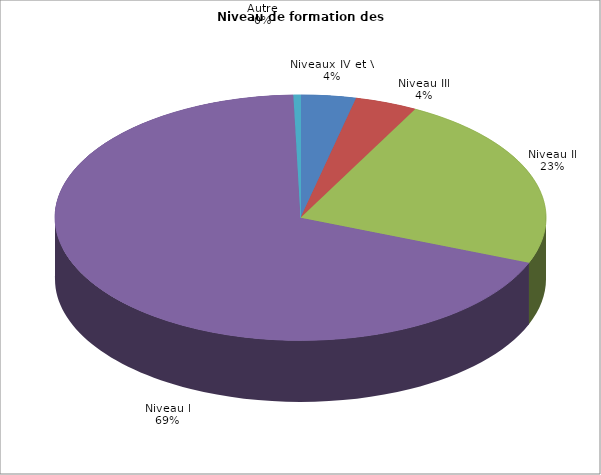
| Category | Nombre de volontaires | % |
|---|---|---|
| Niveaux IV et V | 70 | 0.036 |
| Niveau III | 79 | 0.041 |
| Niveau II | 449 | 0.233 |
| Niveau I | 1322 | 0.685 |
| Autre | 9 | 0.005 |